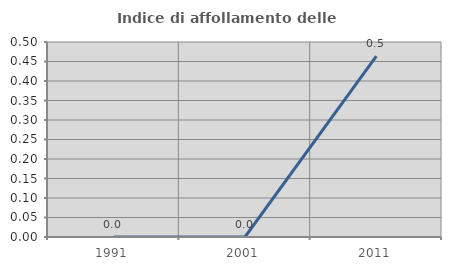
| Category | Indice di affollamento delle abitazioni  |
|---|---|
| 1991.0 | 0 |
| 2001.0 | 0 |
| 2011.0 | 0.464 |